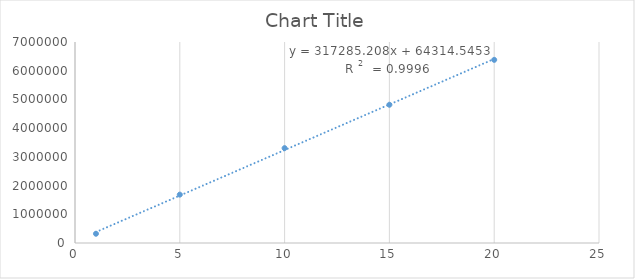
| Category | Series 0 |
|---|---|
| 1.0 | 322354.667 |
| 5.0 | 1684554 |
| 10.0 | 3303590.333 |
| 15.0 | 4814436.333 |
| 20.0 | 6378183 |